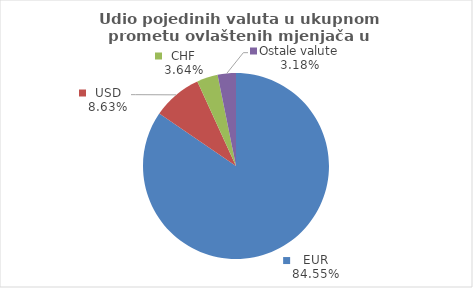
| Category | Series 0 |
|---|---|
| EUR | 84.548 |
| USD | 8.632 |
| CHF | 3.639 |
| Ostale valute | 3.181 |